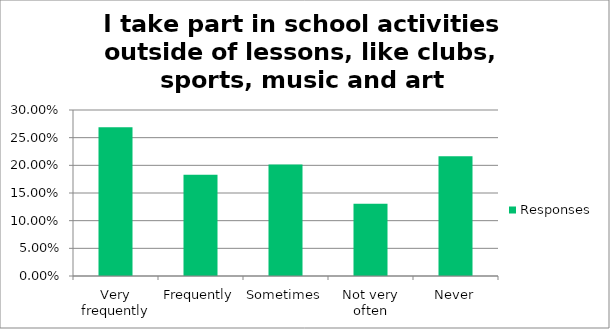
| Category | Responses |
|---|---|
| Very frequently | 0.269 |
| Frequently | 0.183 |
| Sometimes | 0.202 |
| Not very often | 0.131 |
| Never | 0.216 |